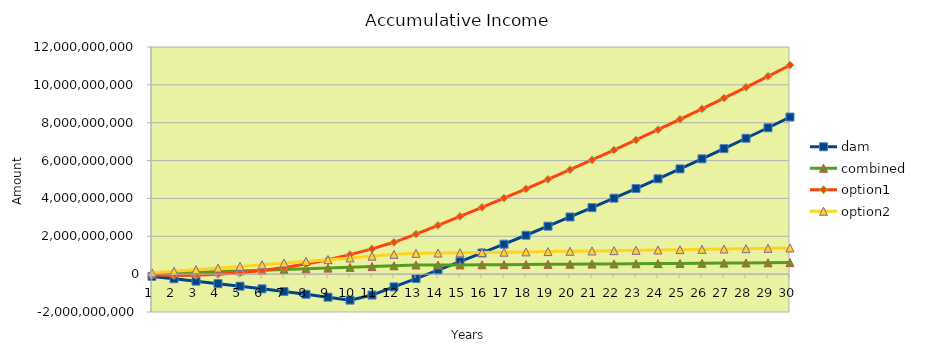
| Category | dam | combined | option1 | option2 |
|---|---|---|---|---|
| 0 | -120000000 | 17170000 | -50830000 | 68000000 |
| 1 | -243627000 | 68377791.603 | -65801250 | 151349041.603 |
| 2 | -370962810 | 88091585.965 | -62094005.638 | 235733383.205 |
| 3 | -502090878.225 | 136462707.285 | -11066469.455 | 321168554.308 |
| 4 | -637096321.864 | 170844609.641 | 73276377.141 | 407670317.353 |
| 5 | -776065958.366 | 206230488.993 | 191922512.266 | 495254671.22 |
| 6 | -919088337.289 | 242642728.722 | 345882057.438 | 583937854.77 |
| 7 | -1066253772.74 | 280104157.818 | 536187719.575 | 673736350.45 |
| 8 | -1217654376.378 | 318638059.207 | 763895241.291 | 764666887.941 |
| 9 | -1373384091.027 | 358268178.236 | 1030083859.598 | 856746447.871 |
| 10 | -1104107507.98 | 399018731.307 | 1335856773.201 | 949992265.575 |
| 11 | -672726115.819 | 440914414.665 | 1682341618.52 | 1044421834.921 |
| 12 | -234874002.775 | 483351840.348 | 2110498463.811 | 1099616829.977 |
| 13 | 209545891.964 | 479977466.305 | 2575713793.231 | 1114378966.862 |
| 14 | 660632085.124 | 487177128.3 | 3047907352.593 | 1129362535.801 |
| 15 | 1118484571.182 | 494484785.224 | 3527183815.345 | 1144570858.273 |
| 16 | 1583204844.531 | 501902057.003 | 4013649425.038 | 1160007305.583 |
| 17 | 2054895921.98 | 509430587.858 | 4507412018.877 | 1175675299.602 |
| 18 | 2533662365.59 | 517072046.676 | 5008581051.623 | 1191578313.531 |
| 19 | 3019610305.855 | 524828127.376 | 5517267619.86 | 1207719872.67 |
| 20 | 3512847465.224 | 532700549.286 | 6033584486.621 | 1224103555.195 |
| 21 | 4013483181.983 | 540691057.526 | 6557646106.384 | 1240732992.958 |
| 22 | 4521628434.494 | 548801423.389 | 7089568650.443 | 1257611872.288 |
| 23 | 5037395865.792 | 557033444.739 | 7629470032.662 | 1274743934.808 |
| 24 | 5560899808.56 | 565388946.411 | 8177469935.615 | 1292132978.265 |
| 25 | 6092256310.469 | 573869780.607 | 8733689837.113 | 1309782857.375 |
| 26 | 6631583159.907 | 582477827.316 | 9298253037.132 | 1327697484.671 |
| 27 | 7178999912.086 | 591214994.725 | 9871284685.152 | 1345880831.376 |
| 28 | 7734627915.549 | 600083219.646 | 10452911807.893 | 1364336928.282 |
| 29 | 8298590339.063 | 609084467.941 | 11043263337.474 | 1383069866.642 |